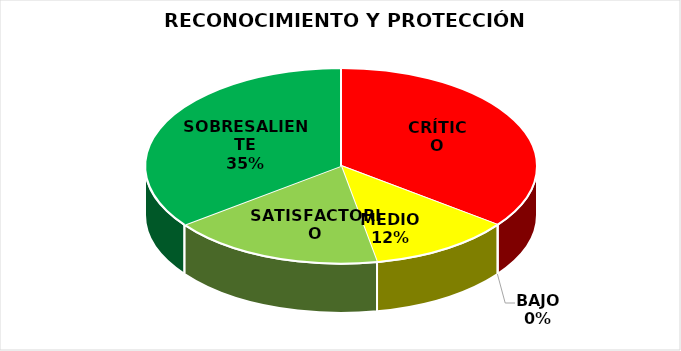
| Category | Series 0 |
|---|---|
| CRÍTICO | 6 |
| BAJO | 0 |
| MEDIO | 2 |
| SATISFACTORIO | 3 |
| SOBRESALIENTE | 6 |